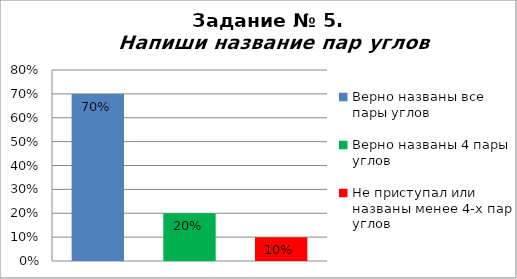
| Category | Напиши название пар углов |
|---|---|
| Верно названы все пары углов | 0.7 |
| Верно названы 4 пары углов | 0.2 |
| Не приступал или названы менее 4-х пар углов | 0.1 |